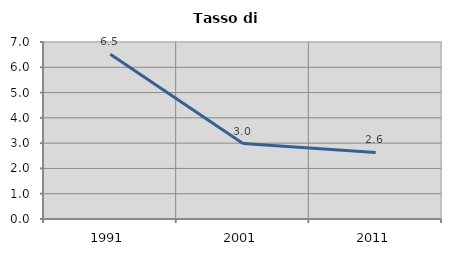
| Category | Tasso di disoccupazione   |
|---|---|
| 1991.0 | 6.512 |
| 2001.0 | 2.985 |
| 2011.0 | 2.632 |